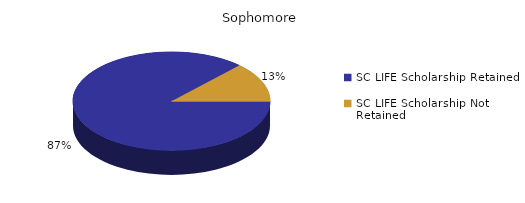
| Category | Sophomore |
|---|---|
| SC LIFE Scholarship Retained  | 1640 |
| SC LIFE Scholarship Not Retained  | 244 |